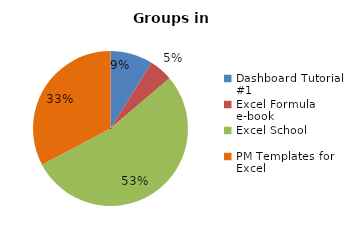
| Category | Series 0 |
|---|---|
| Dashboard Tutorial #1 | 29 |
| Excel Formula e-book | 16 |
| Excel School | 175 |
| PM Templates for Excel | 107 |